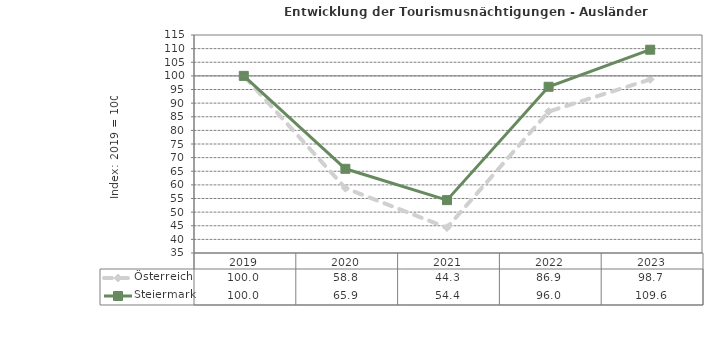
| Category | Österreich | Steiermark |
|---|---|---|
| 2023.0 | 98.7 | 109.6 |
| 2022.0 | 86.9 | 96 |
| 2021.0 | 44.3 | 54.4 |
| 2020.0 | 58.8 | 65.9 |
| 2019.0 | 100 | 100 |